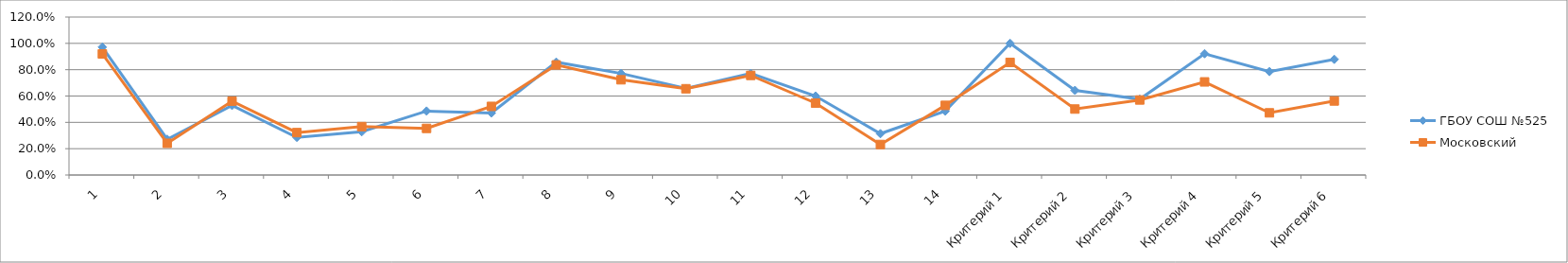
| Category | ГБОУ СОШ №525 | Московский |
|---|---|---|
| 1 | 0.971 | 0.92 |
| 2 | 0.271 | 0.241 |
| 3 | 0.529 | 0.561 |
| 4 | 0.286 | 0.322 |
| 5 | 0.329 | 0.368 |
| 6 | 0.486 | 0.354 |
| 7 | 0.471 | 0.521 |
| 8 | 0.857 | 0.836 |
| 9 | 0.771 | 0.723 |
| 10 | 0.657 | 0.655 |
| 11 | 0.771 | 0.756 |
| 12 | 0.6 | 0.546 |
| 13 | 0.314 | 0.232 |
| 14 | 0.486 | 0.529 |
| Критерий 1 | 1 | 0.855 |
| Критерий 2 | 0.643 | 0.501 |
| Критерий 3 | 0.576 | 0.57 |
| Критерий 4 | 0.921 | 0.707 |
| Критерий 5 | 0.786 | 0.472 |
| Критерий 6 | 0.879 | 0.562 |